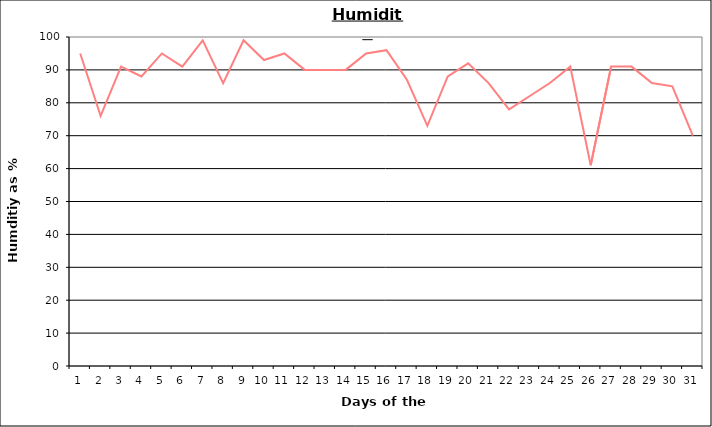
| Category | Series 0 |
|---|---|
| 0 | 95 |
| 1 | 76 |
| 2 | 91 |
| 3 | 88 |
| 4 | 95 |
| 5 | 91 |
| 6 | 99 |
| 7 | 86 |
| 8 | 99 |
| 9 | 93 |
| 10 | 95 |
| 11 | 90 |
| 12 | 90 |
| 13 | 90 |
| 14 | 95 |
| 15 | 96 |
| 16 | 87 |
| 17 | 73 |
| 18 | 88 |
| 19 | 92 |
| 20 | 86 |
| 21 | 78 |
| 22 | 82 |
| 23 | 86 |
| 24 | 91 |
| 25 | 61 |
| 26 | 91 |
| 27 | 91 |
| 28 | 86 |
| 29 | 85 |
| 30 | 70 |